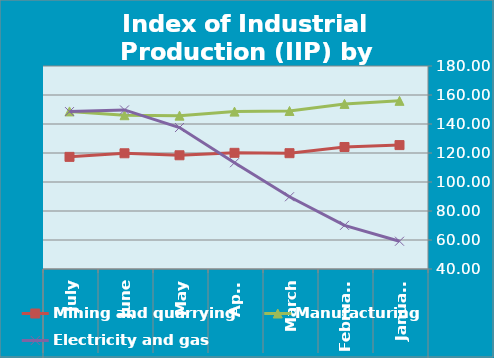
| Category | Mining and quarrying   | Manufacturing | Electricity and gas |
|---|---|---|---|
| 0 | 125.45 | 155.98 | 59.15 |
| 1 | 124.14 | 153.87 | 70.1 |
| 2 | 119.87 | 148.98 | 89.82 |
| 3 | 120.11 | 148.54 | 113.29 |
| 4 | 118.43 | 145.76 | 137.57 |
| 5 | 119.81 | 146.05 | 149.7 |
| 6 | 117.33 | 148.68 | 148.56 |